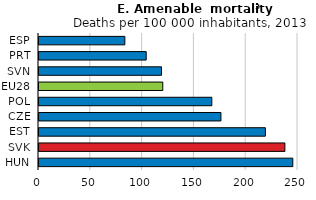
| Category | Eurostat's list (adjusted) |
|---|---|
| ESP | 82.86 |
| PRT | 103.48 |
| SVN | 118.24 |
| EU28 | 119.48 |
| POL | 166.82 |
| CZE | 175.61 |
| EST | 218.51 |
| SVK | 237.34 |
| HUN | 244.98 |